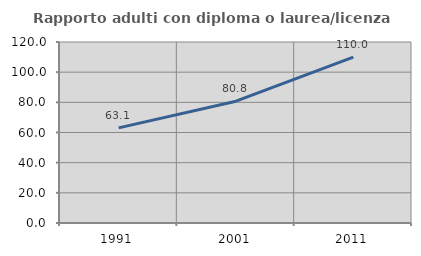
| Category | Rapporto adulti con diploma o laurea/licenza media  |
|---|---|
| 1991.0 | 63.072 |
| 2001.0 | 80.774 |
| 2011.0 | 110.035 |